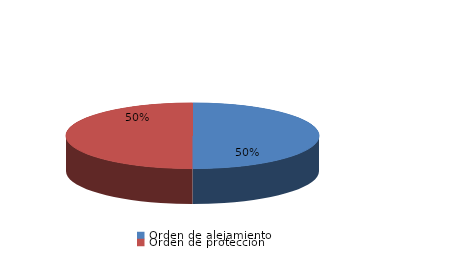
| Category | Series 0 |
|---|---|
| Orden de alejamiento | 8 |
| Orden de protección | 8 |